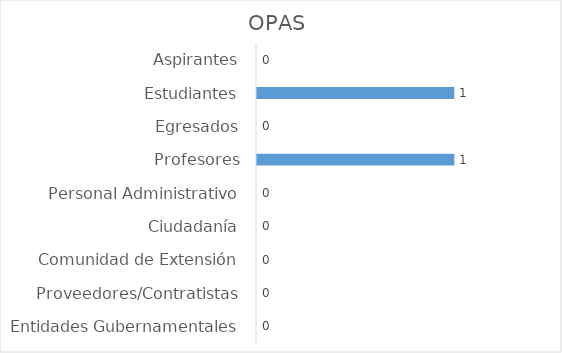
| Category | OPAS |
|---|---|
| Aspirantes | 0 |
| Estudiantes | 1 |
| Egresados | 0 |
| Profesores | 1 |
| Personal Administrativo | 0 |
| Ciudadanía | 0 |
| Comunidad de Extensión | 0 |
| Proveedores/Contratistas | 0 |
| Entidades Gubernamentales | 0 |